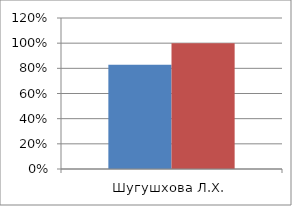
| Category | Series 0 | 2 |
|---|---|---|
| Шугушхова Л.Х. | 0.828 | 1 |